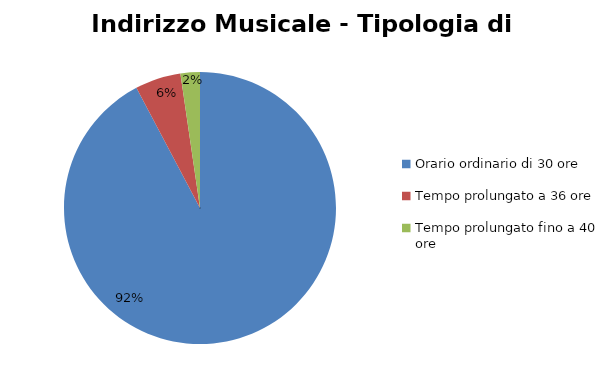
| Category | Series 0 | Series 1 |
|---|---|---|
| Orario ordinario di 30 ore | 2965 |  |
| Tempo prolungato a 36 ore | 175 |  |
| Tempo prolungato fino a 40 ore | 74 |  |